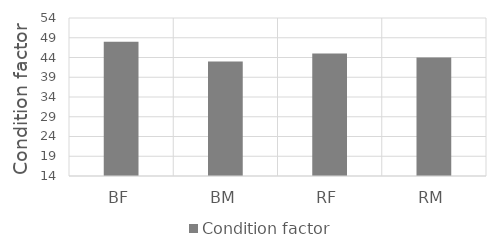
| Category | Condition factor |
|---|---|
| BF | 48 |
| BM | 43 |
| RF | 45 |
| RM | 44 |